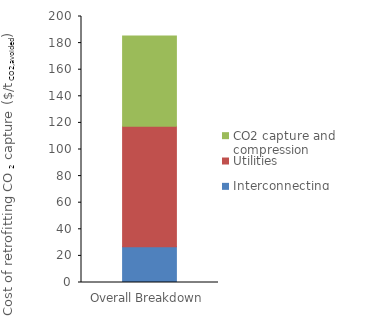
| Category | Interconnecting | Utilities | CO2 capture and compression |
|---|---|---|---|
| 0 | 26.826 | 90.604 | 67.855 |